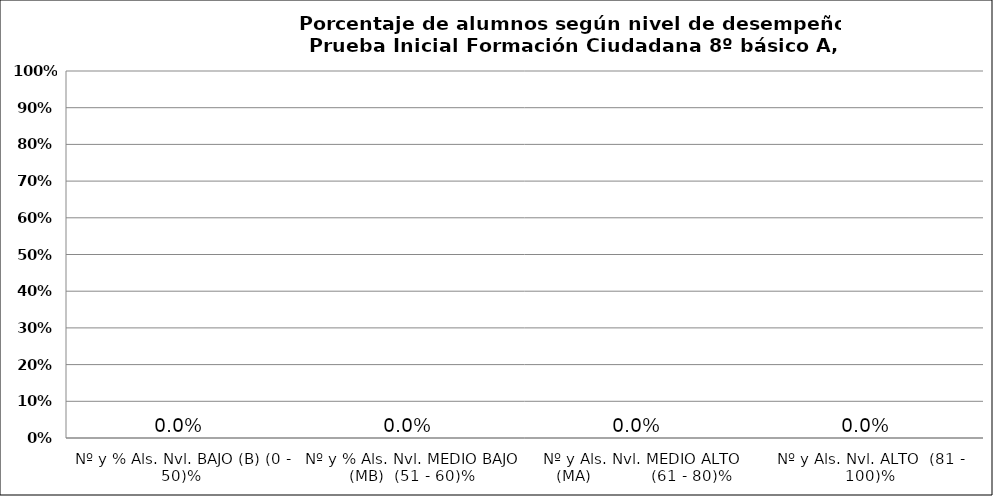
| Category | Series 0 |
|---|---|
| Nº y % Als. Nvl. BAJO (B) (0 - 50)% | 0 |
| Nº y % Als. Nvl. MEDIO BAJO (MB)  (51 - 60)% | 0 |
| Nº y Als. Nvl. MEDIO ALTO (MA)            (61 - 80)% | 0 |
| Nº y Als. Nvl. ALTO  (81 - 100)% | 0 |